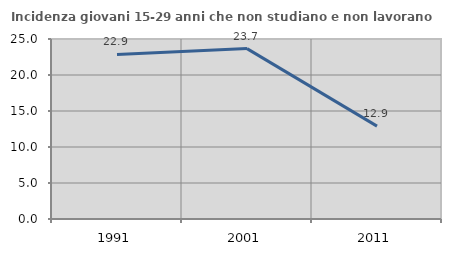
| Category | Incidenza giovani 15-29 anni che non studiano e non lavorano  |
|---|---|
| 1991.0 | 22.857 |
| 2001.0 | 23.664 |
| 2011.0 | 12.903 |